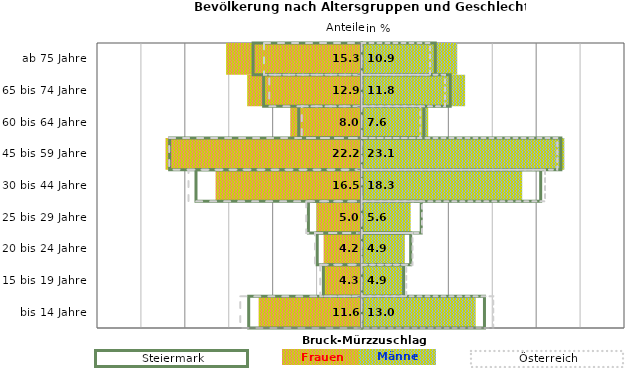
| Category | Frauen | Männer | Frauen Spalte2 | Männer Spalte2 | Frauen Spalte3 | Männer Spalte3 |
|---|---|---|---|---|---|---|
| bis 14 Jahre | -11.6 | 13 | 14 | -12.9 | -13.8 | 15 |
| 15 bis 19 Jahre | -4.3 | 4.9 | 4.8 | -4.4 | -4.7 | 5.1 |
| 20 bis 24 Jahre | -4.2 | 4.9 | 5.6 | -5.1 | -5.3 | 5.8 |
| 25 bis 29 Jahre | -5 | 5.6 | 6.8 | -6.1 | -6.3 | 6.9 |
| 30 bis 44 Jahre | -16.5 | 18.3 | 20.4 | -18.9 | -19.7 | 20.9 |
| 45 bis 59 Jahre | -22.2 | 23.1 | 22.7 | -21.9 | -21.9 | 22.3 |
| 60 bis 64 Jahre | -8 | 7.6 | 7.1 | -7.2 | -6.8 | 6.7 |
| 65 bis 74 Jahre | -12.9 | 11.8 | 10.1 | -11.2 | -10.5 | 9.5 |
| ab 75 Jahre | -15.3 | 10.9 | 8.4 | -12.4 | -11.1 | 7.8 |